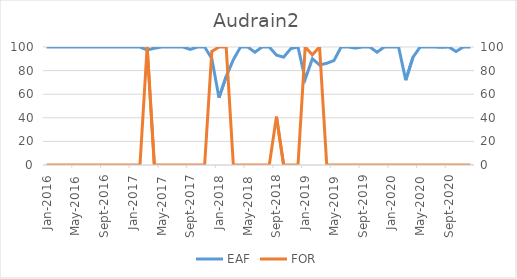
| Category | EAF |
|---|---|
| 2016-01-01 | 100 |
| 2016-02-01 | 100 |
| 2016-03-01 | 100 |
| 2016-04-01 | 100 |
| 2016-05-01 | 100 |
| 2016-06-01 | 100 |
| 2016-07-01 | 100 |
| 2016-08-01 | 100 |
| 2016-09-01 | 100 |
| 2016-10-01 | 100 |
| 2016-11-01 | 100 |
| 2016-12-01 | 100 |
| 2017-01-01 | 100 |
| 2017-02-01 | 100 |
| 2017-03-01 | 97.51 |
| 2017-04-01 | 98.96 |
| 2017-05-01 | 100 |
| 2017-06-01 | 100 |
| 2017-07-01 | 100 |
| 2017-08-01 | 100 |
| 2017-09-01 | 97.95 |
| 2017-10-01 | 100 |
| 2017-11-01 | 100 |
| 2017-12-01 | 90.28 |
| 2018-01-01 | 57.06 |
| 2018-02-01 | 75 |
| 2018-03-01 | 89.24 |
| 2018-04-01 | 100 |
| 2018-05-01 | 100 |
| 2018-06-01 | 95.59 |
| 2018-07-01 | 100 |
| 2018-08-01 | 100 |
| 2018-09-01 | 93.12 |
| 2018-10-01 | 91.41 |
| 2018-11-01 | 98.62 |
| 2018-12-01 | 100 |
| 2019-01-01 | 72.65 |
| 2019-02-01 | 90.03 |
| 2019-03-01 | 84.79 |
| 2019-04-01 | 86.2 |
| 2019-05-01 | 88.48 |
| 2019-06-01 | 100 |
| 2019-07-01 | 100 |
| 2019-08-01 | 99.09 |
| 2019-09-01 | 100 |
| 2019-10-01 | 100 |
| 2019-11-01 | 95.6 |
| 2019-12-01 | 100 |
| 2020-01-01 | 100 |
| 2020-02-01 | 100 |
| 2020-03-01 | 71.87 |
| 2020-04-01 | 91.25 |
| 2020-05-01 | 100 |
| 2020-06-01 | 100 |
| 2020-07-01 | 100 |
| 2020-08-01 | 99.66 |
| 2020-09-01 | 100 |
| 2020-10-01 | 96.19 |
| 2020-11-01 | 100 |
| 2020-12-01 | 100 |